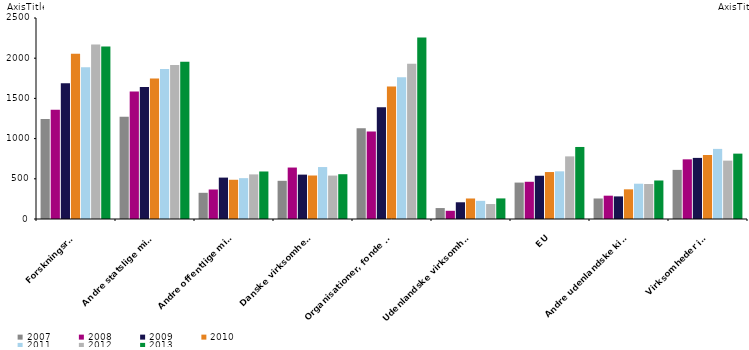
| Category | 2007 | 2008 | 2009 | 2010 | 2011 | 2012 | 2013 |
|---|---|---|---|---|---|---|---|
| Forskningsråd | 1243 | 1358 | 1687 | 2056 | 1886 | 2170 | 2145 |
| Andre statslige midler | 1273 | 1587 | 1643 | 1749 | 1867 | 1915 | 1956 |
| Andre offentlige midler | 326 | 367 | 515 | 488 | 508 | 555 | 591 |
| Danske virksomheder | 475 | 640 | 552 | 541 | 646 | 540 | 557 |
| Organisationer, fonde mv. | 1128 | 1088 | 1391 | 1647 | 1764 | 1932 | 2257 |
| Udenlandske virksomheder | 136 | 102 | 208 | 255 | 226 | 186 | 256 |
| EU | 453 | 463 | 538 | 584 | 593 | 779 | 896 |
| Andre udenlandske kilder | 255 | 290 | 281 | 369 | 439 | 435 | 479 |
| Virksomheder i alt | 611 | 742 | 760 | 796 | 872 | 726 | 813 |